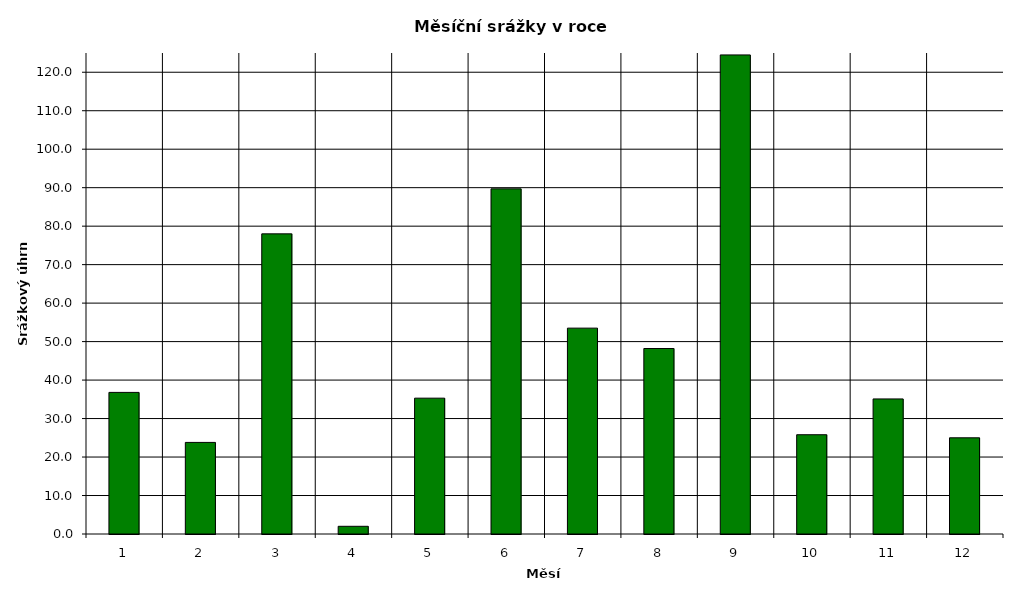
| Category | Series 0 |
|---|---|
| 0 | 36.8 |
| 1 | 23.8 |
| 2 | 78 |
| 3 | 2 |
| 4 | 35.3 |
| 5 | 89.7 |
| 6 | 53.5 |
| 7 | 48.2 |
| 8 | 124.5 |
| 9 | 25.8 |
| 10 | 35.1 |
| 11 | 25 |